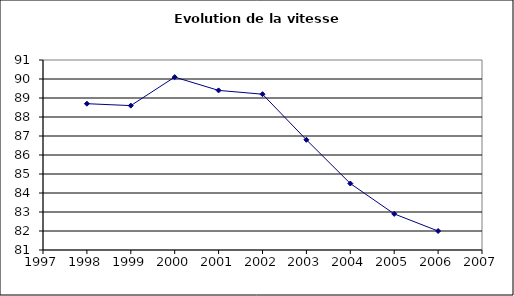
| Category | Series 0 |
|---|---|
| 1998.0 | 88.7 |
| 1999.0 | 88.6 |
| 2000.0 | 90.1 |
| 2001.0 | 89.4 |
| 2002.0 | 89.2 |
| 2003.0 | 86.8 |
| 2004.0 | 84.5 |
| 2005.0 | 82.9 |
| 2006.0 | 82 |